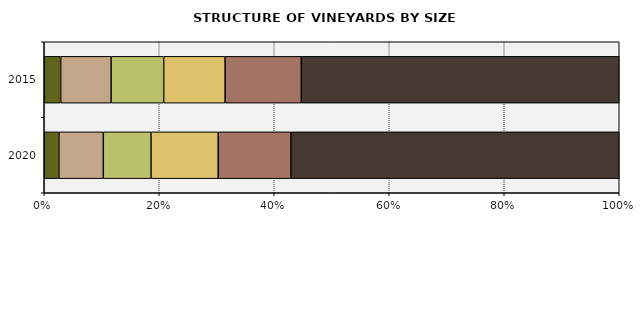
| Category | < 0.10 | 0.10–0.49 | 0.50–2.99 | 3.00–9.99 | 10.00–29.99 | ≥ 30.0 |
|---|---|---|---|---|---|---|
| 2020.0 | 461.553 | 1397.425 | 1501.095 | 2116.247 | 2287.317 | 10335.727 |
| 2015.0 | 504.782 | 1552.186 | 1617.335 | 1889.059 | 2343.44 | 9781.788 |